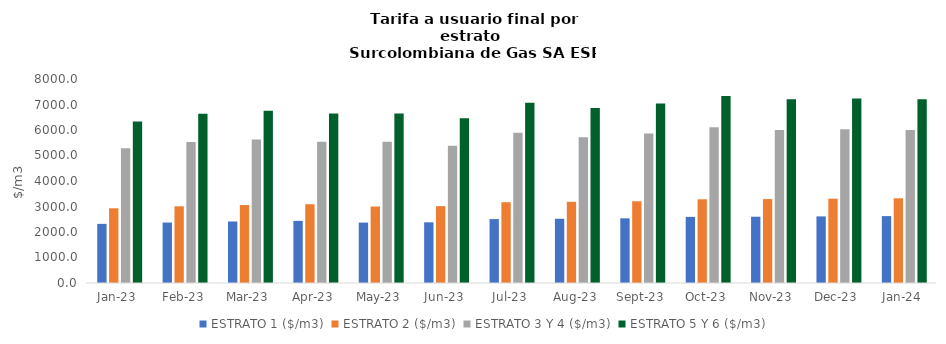
| Category | ESTRATO 1 ($/m3) | ESTRATO 2 ($/m3) | ESTRATO 3 Y 4 ($/m3) | ESTRATO 5 Y 6 ($/m3) |
|---|---|---|---|---|
| 2023-01-01 | 2319.28 | 2930.28 | 5279.8 | 6335.76 |
| 2023-02-01 | 2371.01 | 3007.35 | 5533.45 | 6640.14 |
| 2023-03-01 | 2411.54 | 3057.29 | 5630.28 | 6756.336 |
| 2023-04-01 | 2436.88 | 3089.41 | 5539.66 | 6647.592 |
| 2023-05-01 | 2368.72 | 3000.27 | 5539.66 | 6647.592 |
| 2023-06-01 | 2379.07 | 3013.38 | 5382.53 | 6459.036 |
| 2023-07-01 | 2506.06 | 3167.43 | 5894.36 | 7073.232 |
| 2023-08-01 | 2518.61 | 3183.29 | 5720.38 | 6864.456 |
| 2023-09-01 | 2536.22 | 3205.55 | 5864.55 | 7037.46 |
| 2023-10-01 | 2592.91 | 3282.61 | 6107.41 | 7328.892 |
| 2023-11-01 | 2599.39 | 3290.81 | 6004.48 | 7205.376 |
| 2023-12-01 | 2611.58 | 3306.24 | 6032.48 | 7238.976 |
| 2024-01-01 | 2623.58 | 3321.44 | 6004.16 | 7204.992 |